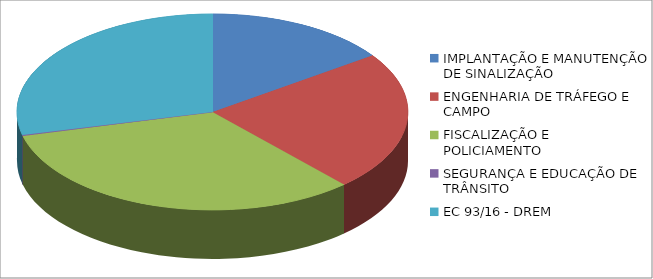
| Category | Series 0 | Series 1 |
|---|---|---|
| IMPLANTAÇÃO E MANUTENÇÃO DE SINALIZAÇÃO | 1519212.58 |  |
| ENGENHARIA DE TRÁFEGO E CAMPO | 2300664.01 |  |
| FISCALIZAÇÃO E POLICIAMENTO | 3274253.77 |  |
| SEGURANÇA E EDUCAÇÃO DE TRÂNSITO | 14705.07 |  |
| EC 93/16 - DREM | 2874599.69 |  |